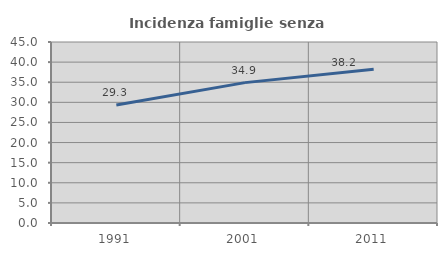
| Category | Incidenza famiglie senza nuclei |
|---|---|
| 1991.0 | 29.349 |
| 2001.0 | 34.899 |
| 2011.0 | 38.239 |